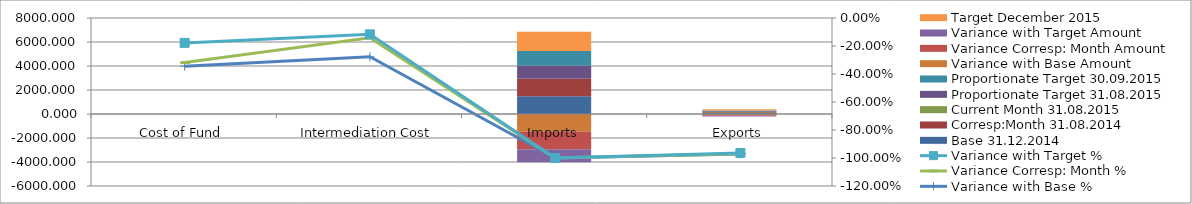
| Category | Base 31.12.2014 | Corresp:Month 31.08.2014 | Current Month 31.08.2015 | Proportionate Target 31.08.2015 | Proportionate Target 30.09.2015 | Variance with Base Amount  | Variance Corresp: Month Amount | Variance with Target Amount | Target December 2015 |
|---|---|---|---|---|---|---|---|---|---|
| Cost of Fund | 0.468 | 0.45 | 0.307 | 0.373 | 0.373 | -0.161 | -0.143 | -0.066 | 0.37 |
| Intermediation Cost | 0.36 | 0.303 | 0.26 | 0.295 | 0.292 | -0.1 | -0.043 | -0.034 | 0.282 |
| Imports | 1473.237 | 1473.237 | 0 | 1080.374 | 1215.421 | -1473.237 | -1473.237 | -1080.374 | 1620.561 |
| Exports | 78.792 | 76.044 | 2.252 | 63.034 | 70.913 | -76.54 | -73.792 | -60.782 | 94.55 |